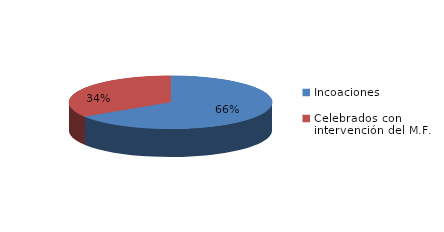
| Category | Series 0 |
|---|---|
| Incoaciones | 4891 |
| Celebrados con intervención del M.F. | 2526 |